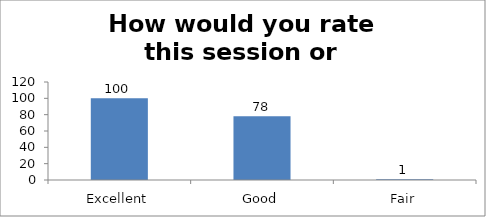
| Category | How would you rate this session or workshop? |
|---|---|
| Excellent | 100 |
| Good | 78 |
| Fair | 1 |